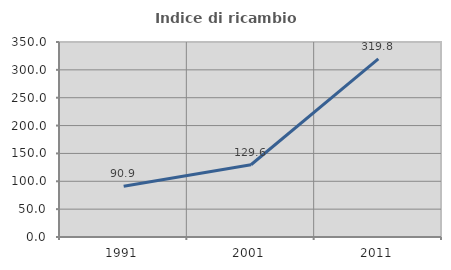
| Category | Indice di ricambio occupazionale  |
|---|---|
| 1991.0 | 90.909 |
| 2001.0 | 129.646 |
| 2011.0 | 319.841 |